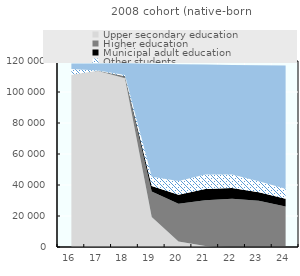
| Category | Upper secondary education | Higher education | Municipal adult education | Other students | Non-students |
|---|---|---|---|---|---|
| 16.0 | 111128 | 1 | 24 | 3750 | 3500 |
| 17.0 | 113628 | 19 | 49 | 121 | 4639 |
| 18.0 | 108838 | 1017 | 266 | 767 | 7632 |
| 19.0 | 19314 | 16510 | 3599 | 5865 | 72956 |
| 20.0 | 3597 | 24285 | 5844 | 8784 | 75456 |
| 21.0 | 607 | 29615 | 7143 | 9485 | 70867 |
| 22.0 | 48 | 31136 | 6910 | 8685 | 70720 |
| 23.0 | 5 | 29910 | 5438 | 7144 | 74827 |
| 24.0 | 0 | 26142 | 5011 | 6389 | 79634 |